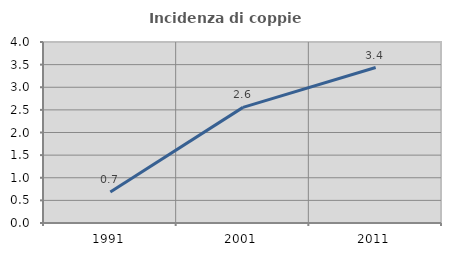
| Category | Incidenza di coppie miste |
|---|---|
| 1991.0 | 0.686 |
| 2001.0 | 2.555 |
| 2011.0 | 3.435 |